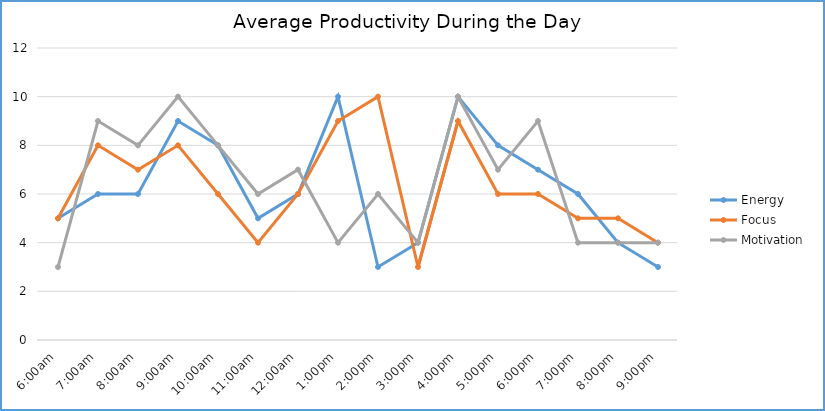
| Category | Energy | Focus | Motivation |
|---|---|---|---|
| 6:00am | 5 | 5 | 3 |
| 7:00am | 6 | 8 | 9 |
| 8:00am | 6 | 7 | 8 |
| 9:00am | 9 | 8 | 10 |
| 10:00am | 8 | 6 | 8 |
| 11:00am | 5 | 4 | 6 |
| 12:00am | 6 | 6 | 7 |
| 1:00pm | 10 | 9 | 4 |
| 2:00pm | 3 | 10 | 6 |
| 3:00pm | 4 | 3 | 4 |
| 4:00pm | 10 | 9 | 10 |
| 5:00pm | 8 | 6 | 7 |
| 6:00pm | 7 | 6 | 9 |
| 7:00pm | 6 | 5 | 4 |
| 8:00pm | 4 | 5 | 4 |
| 9:00pm | 3 | 4 | 4 |